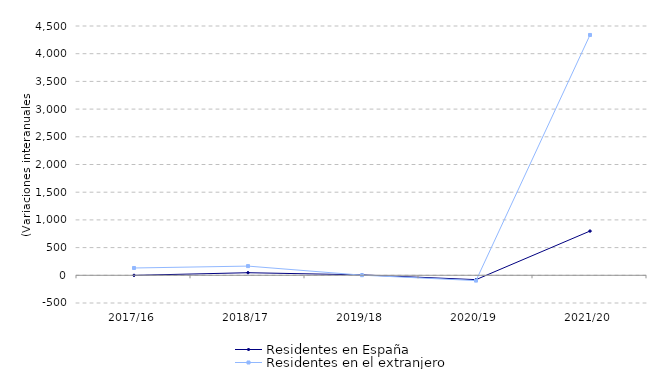
| Category | Residentes en España | Residentes en el extranjero |
|---|---|---|
| 2017/16 | -0.91 | 131.835 |
| 2018/17 | 46.861 | 166.02 |
| 2019/18 | 7.985 | 2.216 |
| 2020/19 | -78.59 | -95.749 |
| 2021/20 | 798.687 | 4338.255 |